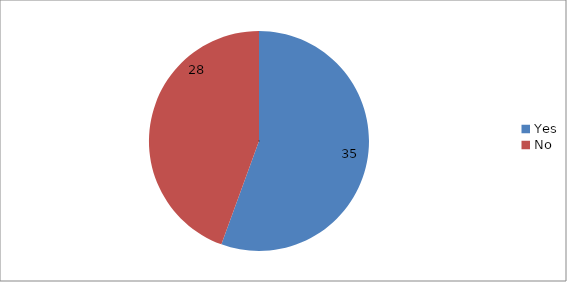
| Category | Series 0 |
|---|---|
| Yes | 35 |
| No | 28 |